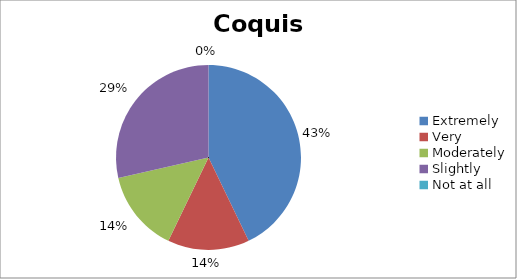
| Category | Coquis |
|---|---|
| Extremely | 3 |
| Very | 1 |
| Moderately | 1 |
| Slightly | 2 |
| Not at all | 0 |